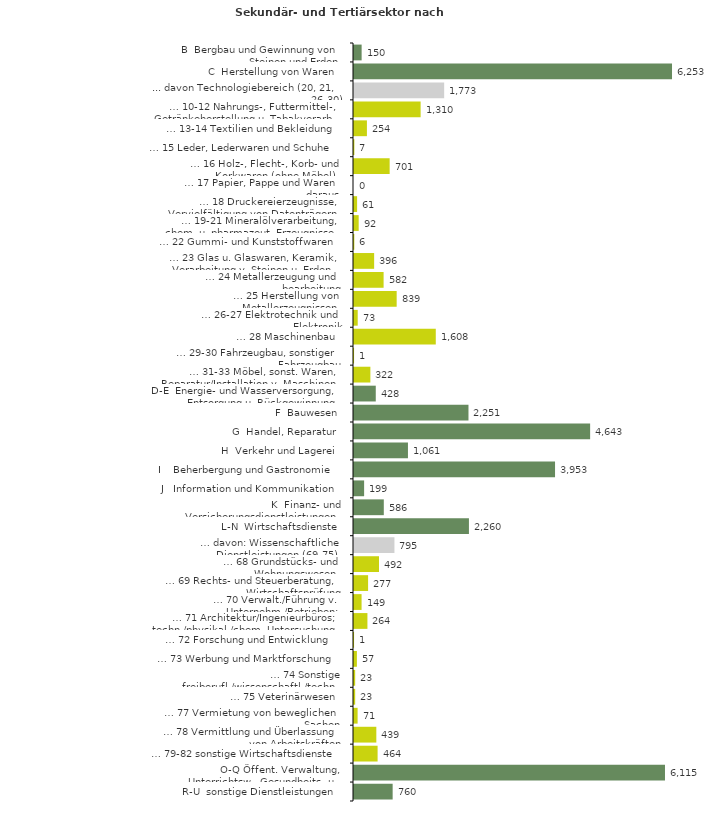
| Category | Series 0 |
|---|---|
| B  Bergbau und Gewinnung von Steinen und Erden | 150 |
| C  Herstellung von Waren | 6253 |
| ... davon Technologiebereich (20, 21, 26-30) | 1773 |
| … 10-12 Nahrungs-, Futtermittel-, Getränkeherstellung u. Tabakverarb. | 1310 |
| … 13-14 Textilien und Bekleidung | 254 |
| … 15 Leder, Lederwaren und Schuhe | 7 |
| … 16 Holz-, Flecht-, Korb- und Korkwaren (ohne Möbel)  | 701 |
| … 17 Papier, Pappe und Waren daraus  | 0 |
| … 18 Druckereierzeugnisse, Vervielfältigung von Datenträgern | 61 |
| … 19-21 Mineralölverarbeitung, chem. u. pharmazeut. Erzeugnisse | 92 |
| … 22 Gummi- und Kunststoffwaren | 6 |
| … 23 Glas u. Glaswaren, Keramik, Verarbeitung v. Steinen u. Erden  | 396 |
| … 24 Metallerzeugung und -bearbeitung | 582 |
| … 25 Herstellung von Metallerzeugnissen  | 839 |
| … 26-27 Elektrotechnik und Elektronik | 73 |
| … 28 Maschinenbau | 1608 |
| … 29-30 Fahrzeugbau, sonstiger Fahrzeugbau | 1 |
| … 31-33 Möbel, sonst. Waren, Reparatur/Installation v. Maschinen | 322 |
| D-E  Energie- und Wasserversorgung, Entsorgung u. Rückgewinnung | 428 |
| F  Bauwesen | 2251 |
| G  Handel, Reparatur | 4643 |
| H  Verkehr und Lagerei | 1061 |
| I    Beherbergung und Gastronomie | 3953 |
| J   Information und Kommunikation | 199 |
| K  Finanz- und Versicherungsdienstleistungen | 586 |
| L-N  Wirtschaftsdienste | 2260 |
| … davon: Wissenschaftliche Dienstleistungen (69-75) | 795 |
| … 68 Grundstücks- und Wohnungswesen  | 492 |
| … 69 Rechts- und Steuerberatung, Wirtschaftsprüfung | 277 |
| … 70 Verwalt./Führung v. Unternehm./Betrieben; Unternehmensberat. | 149 |
| … 71 Architektur/Ingenieurbüros; techn./physikal./chem. Untersuchung | 264 |
| … 72 Forschung und Entwicklung  | 1 |
| … 73 Werbung und Marktforschung | 57 |
| … 74 Sonstige freiberufl./wissenschaftl./techn. Tätigkeiten | 23 |
| … 75 Veterinärwesen | 23 |
| … 77 Vermietung von beweglichen Sachen  | 71 |
| … 78 Vermittlung und Überlassung von Arbeitskräften | 439 |
| … 79-82 sonstige Wirtschaftsdienste | 464 |
| O-Q Öffent. Verwaltung, Unterrichtsw., Gesundheits- u. Sozialwesen | 6115 |
| R-U  sonstige Dienstleistungen | 760 |